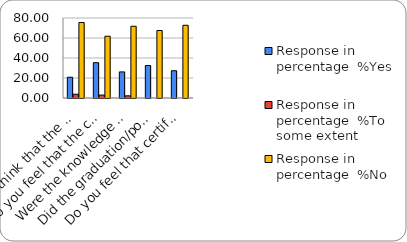
| Category | Response in percentage  |
|---|---|
| Do you think that the curriculum which you had during your graduation/post graduation has provided you with the knowledge & skills necessary to get employed/Self-employed or start own business? | 75.472 |
| Do you feel that the curriculum you studied is helpful in progression to higher studies? | 61.765 |
| Were the knowledge & skills acquired through the curriculum useful to you while working on the job?   | 71.739 |
| Did the graduation/post-graduation programme bring about any attitudinal and behavioural change in you? | 67.5 |
| Do you feel that certificate/ diploma courses offered by the college in addition to the curriculum lead to better career prospects? | 72.727 |